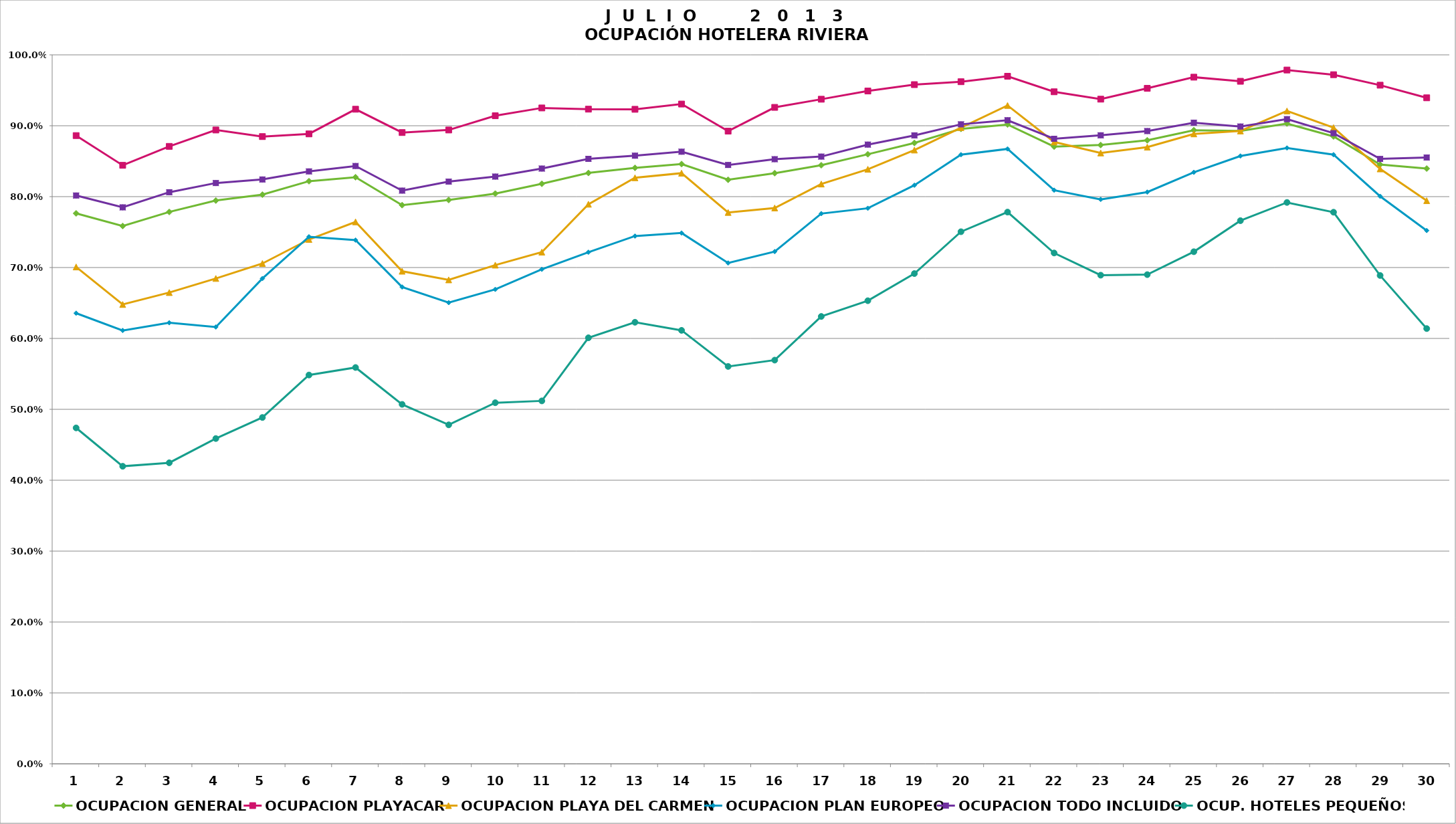
| Category | OCUPACION GENERAL | OCUPACION PLAYACAR | OCUPACION PLAYA DEL CARMEN | OCUPACION PLAN EUROPEO | OCUPACION TODO INCLUIDO | OCUP. HOTELES PEQUEÑOS |
|---|---|---|---|---|---|---|
| 1.0 | 0.776 | 0.886 | 0.701 | 0.636 | 0.802 | 0.474 |
| 2.0 | 0.759 | 0.844 | 0.648 | 0.611 | 0.785 | 0.42 |
| 3.0 | 0.778 | 0.871 | 0.665 | 0.622 | 0.806 | 0.425 |
| 4.0 | 0.794 | 0.894 | 0.685 | 0.616 | 0.819 | 0.459 |
| 5.0 | 0.803 | 0.885 | 0.706 | 0.684 | 0.824 | 0.488 |
| 6.0 | 0.822 | 0.888 | 0.74 | 0.743 | 0.836 | 0.548 |
| 7.0 | 0.827 | 0.923 | 0.764 | 0.739 | 0.843 | 0.559 |
| 8.0 | 0.788 | 0.89 | 0.695 | 0.672 | 0.808 | 0.507 |
| 9.0 | 0.795 | 0.894 | 0.683 | 0.65 | 0.821 | 0.478 |
| 10.0 | 0.804 | 0.914 | 0.703 | 0.669 | 0.828 | 0.509 |
| 11.0 | 0.818 | 0.925 | 0.722 | 0.698 | 0.84 | 0.512 |
| 12.0 | 0.833 | 0.923 | 0.789 | 0.722 | 0.853 | 0.601 |
| 13.0 | 0.841 | 0.923 | 0.827 | 0.744 | 0.858 | 0.623 |
| 14.0 | 0.846 | 0.931 | 0.833 | 0.749 | 0.863 | 0.611 |
| 15.0 | 0.824 | 0.892 | 0.778 | 0.706 | 0.845 | 0.56 |
| 16.0 | 0.833 | 0.926 | 0.784 | 0.722 | 0.853 | 0.569 |
| 17.0 | 0.844 | 0.937 | 0.818 | 0.776 | 0.856 | 0.631 |
| 18.0 | 0.86 | 0.949 | 0.839 | 0.784 | 0.873 | 0.653 |
| 19.0 | 0.876 | 0.958 | 0.866 | 0.816 | 0.886 | 0.692 |
| 20.0 | 0.896 | 0.962 | 0.897 | 0.859 | 0.902 | 0.75 |
| 21.0 | 0.902 | 0.97 | 0.929 | 0.867 | 0.908 | 0.778 |
| 22.0 | 0.871 | 0.948 | 0.877 | 0.809 | 0.882 | 0.72 |
| 23.0 | 0.873 | 0.938 | 0.862 | 0.796 | 0.886 | 0.689 |
| 24.0 | 0.88 | 0.953 | 0.87 | 0.806 | 0.892 | 0.69 |
| 25.0 | 0.894 | 0.968 | 0.888 | 0.834 | 0.904 | 0.722 |
| 26.0 | 0.893 | 0.963 | 0.893 | 0.857 | 0.899 | 0.766 |
| 27.0 | 0.903 | 0.979 | 0.921 | 0.869 | 0.909 | 0.792 |
| 28.0 | 0.885 | 0.972 | 0.897 | 0.859 | 0.89 | 0.778 |
| 29.0 | 0.845 | 0.957 | 0.839 | 0.8 | 0.853 | 0.689 |
| 30.0 | 0.84 | 0.939 | 0.794 | 0.752 | 0.855 | 0.614 |